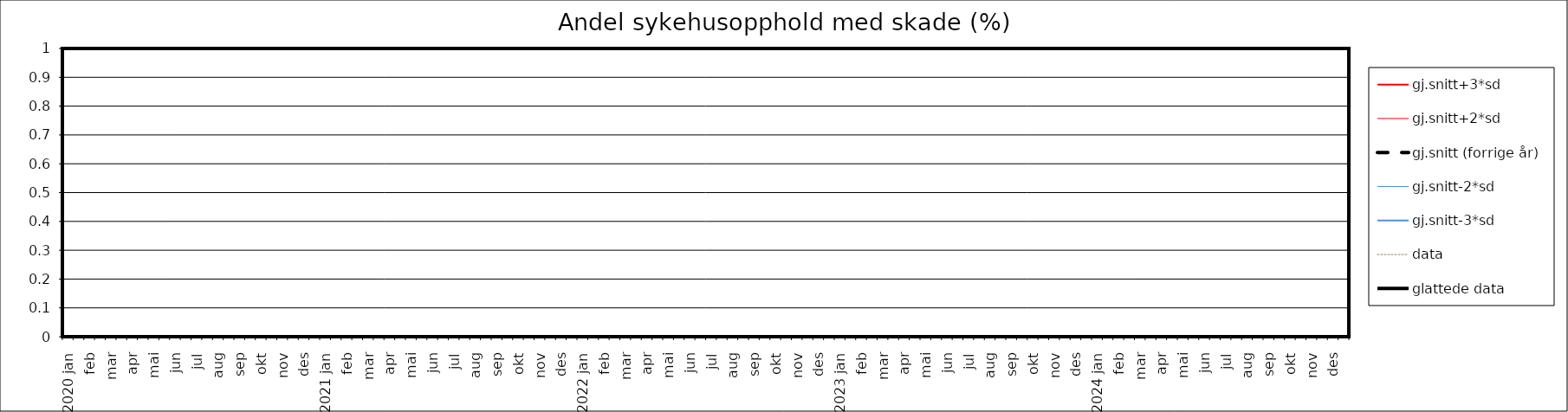
| Category | gj.snitt+3*sd | gj.snitt+2*sd | gj.snitt (forrige år) | gj.snitt-2*sd | gj.snitt-3*sd | data | glattede data |
|---|---|---|---|---|---|---|---|
| 2020 jan | 0 | 0 | 0 | 0 | 0 | 0 | 0 |
|  | 0 | 0 | 0 | 0 | 0 | 0 | 0 |
| feb | 0 | 0 | 0 | 0 | 0 | 0 | 0 |
|  | 0 | 0 | 0 | 0 | 0 | 0 | 0 |
| mar | 0 | 0 | 0 | 0 | 0 | 0 | 0 |
|  | 0 | 0 | 0 | 0 | 0 | 0 | 0 |
| apr | 0 | 0 | 0 | 0 | 0 | 0 | 0 |
|  | 0 | 0 | 0 | 0 | 0 | 0 | 0 |
| mai | 0 | 0 | 0 | 0 | 0 | 0 | 0 |
|  | 0 | 0 | 0 | 0 | 0 | 0 | 0 |
| jun | 0 | 0 | 0 | 0 | 0 | 0 | 0 |
|  | 0 | 0 | 0 | 0 | 0 | 0 | 0 |
| jul | 0 | 0 | 0 | 0 | 0 | 0 | 0 |
|  | 0 | 0 | 0 | 0 | 0 | 0 | 0 |
| aug | 0 | 0 | 0 | 0 | 0 | 0 | 0 |
|  | 0 | 0 | 0 | 0 | 0 | 0 | 0 |
| sep | 0 | 0 | 0 | 0 | 0 | 0 | 0 |
|  | 0 | 0 | 0 | 0 | 0 | 0 | 0 |
| okt | 0 | 0 | 0 | 0 | 0 | 0 | 0 |
|  | 0 | 0 | 0 | 0 | 0 | 0 | 0 |
| nov | 0 | 0 | 0 | 0 | 0 | 0 | 0 |
|  | 0 | 0 | 0 | 0 | 0 | 0 | 0 |
| des | 0 | 0 | 0 | 0 | 0 | 0 | 0 |
|  | 0 | 0 | 0 | 0 | 0 | 0 | 0 |
| 2021 jan | 0 | 0 | 0 | 0 | 0 | 0 | 0 |
|  | 0 | 0 | 0 | 0 | 0 | 0 | 0 |
| feb | 0 | 0 | 0 | 0 | 0 | 0 | 0 |
|  | 0 | 0 | 0 | 0 | 0 | 0 | 0 |
| mar | 0 | 0 | 0 | 0 | 0 | 0 | 0 |
|  | 0 | 0 | 0 | 0 | 0 | 0 | 0 |
| apr | 0 | 0 | 0 | 0 | 0 | 0 | 0 |
|  | 0 | 0 | 0 | 0 | 0 | 0 | 0 |
| mai | 0 | 0 | 0 | 0 | 0 | 0 | 0 |
|  | 0 | 0 | 0 | 0 | 0 | 0 | 0 |
| jun | 0 | 0 | 0 | 0 | 0 | 0 | 0 |
|  | 0 | 0 | 0 | 0 | 0 | 0 | 0 |
| jul | 0 | 0 | 0 | 0 | 0 | 0 | 0 |
|  | 0 | 0 | 0 | 0 | 0 | 0 | 0 |
| aug | 0 | 0 | 0 | 0 | 0 | 0 | 0 |
|  | 0 | 0 | 0 | 0 | 0 | 0 | 0 |
| sep | 0 | 0 | 0 | 0 | 0 | 0 | 0 |
|  | 0 | 0 | 0 | 0 | 0 | 0 | 0 |
| okt | 0 | 0 | 0 | 0 | 0 | 0 | 0 |
|  | 0 | 0 | 0 | 0 | 0 | 0 | 0 |
| nov | 0 | 0 | 0 | 0 | 0 | 0 | 0 |
|  | 0 | 0 | 0 | 0 | 0 | 0 | 0 |
| des | 0 | 0 | 0 | 0 | 0 | 0 | 0 |
|  | 0 | 0 | 0 | 0 | 0 | 0 | 0 |
| 2022 jan | 0 | 0 | 0 | 0 | 0 | 0 | 0 |
|  | 0 | 0 | 0 | 0 | 0 | 0 | 0 |
| feb | 0 | 0 | 0 | 0 | 0 | 0 | 0 |
|  | 0 | 0 | 0 | 0 | 0 | 0 | 0 |
| mar | 0 | 0 | 0 | 0 | 0 | 0 | 0 |
|  | 0 | 0 | 0 | 0 | 0 | 0 | 0 |
| apr | 0 | 0 | 0 | 0 | 0 | 0 | 0 |
|  | 0 | 0 | 0 | 0 | 0 | 0 | 0 |
| mai | 0 | 0 | 0 | 0 | 0 | 0 | 0 |
|  | 0 | 0 | 0 | 0 | 0 | 0 | 0 |
| jun | 0 | 0 | 0 | 0 | 0 | 0 | 0 |
|  | 0 | 0 | 0 | 0 | 0 | 0 | 0 |
| jul | 0 | 0 | 0 | 0 | 0 | 0 | 0 |
|  | 0 | 0 | 0 | 0 | 0 | 0 | 0 |
| aug | 0 | 0 | 0 | 0 | 0 | 0 | 0 |
|  | 0 | 0 | 0 | 0 | 0 | 0 | 0 |
| sep | 0 | 0 | 0 | 0 | 0 | 0 | 0 |
|  | 0 | 0 | 0 | 0 | 0 | 0 | 0 |
| okt | 0 | 0 | 0 | 0 | 0 | 0 | 0 |
|  | 0 | 0 | 0 | 0 | 0 | 0 | 0 |
| nov | 0 | 0 | 0 | 0 | 0 | 0 | 0 |
|  | 0 | 0 | 0 | 0 | 0 | 0 | 0 |
| des | 0 | 0 | 0 | 0 | 0 | 0 | 0 |
|  | 0 | 0 | 0 | 0 | 0 | 0 | 0 |
| 2023 jan | 0 | 0 | 0 | 0 | 0 | 0 | 0 |
|  | 0 | 0 | 0 | 0 | 0 | 0 | 0 |
| feb | 0 | 0 | 0 | 0 | 0 | 0 | 0 |
|  | 0 | 0 | 0 | 0 | 0 | 0 | 0 |
| mar | 0 | 0 | 0 | 0 | 0 | 0 | 0 |
|  | 0 | 0 | 0 | 0 | 0 | 0 | 0 |
| apr | 0 | 0 | 0 | 0 | 0 | 0 | 0 |
|  | 0 | 0 | 0 | 0 | 0 | 0 | 0 |
| mai | 0 | 0 | 0 | 0 | 0 | 0 | 0 |
|  | 0 | 0 | 0 | 0 | 0 | 0 | 0 |
| jun | 0 | 0 | 0 | 0 | 0 | 0 | 0 |
|  | 0 | 0 | 0 | 0 | 0 | 0 | 0 |
| jul | 0 | 0 | 0 | 0 | 0 | 0 | 0 |
|  | 0 | 0 | 0 | 0 | 0 | 0 | 0 |
| aug | 0 | 0 | 0 | 0 | 0 | 0 | 0 |
|  | 0 | 0 | 0 | 0 | 0 | 0 | 0 |
| sep | 0 | 0 | 0 | 0 | 0 | 0 | 0 |
|  | 0 | 0 | 0 | 0 | 0 | 0 | 0 |
| okt | 0 | 0 | 0 | 0 | 0 | 0 | 0 |
|  | 0 | 0 | 0 | 0 | 0 | 0 | 0 |
| nov | 0 | 0 | 0 | 0 | 0 | 0 | 0 |
|  | 0 | 0 | 0 | 0 | 0 | 0 | 0 |
| des | 0 | 0 | 0 | 0 | 0 | 0 | 0 |
|  | 0 | 0 | 0 | 0 | 0 | 0 | 0 |
| 2024 jan | 0 | 0 | 0 | 0 | 0 | 0 | 0 |
|  | 0 | 0 | 0 | 0 | 0 | 0 | 0 |
| feb | 0 | 0 | 0 | 0 | 0 | 0 | 0 |
|  | 0 | 0 | 0 | 0 | 0 | 0 | 0 |
| mar | 0 | 0 | 0 | 0 | 0 | 0 | 0 |
|  | 0 | 0 | 0 | 0 | 0 | 0 | 0 |
| apr | 0 | 0 | 0 | 0 | 0 | 0 | 0 |
|  | 0 | 0 | 0 | 0 | 0 | 0 | 0 |
| mai | 0 | 0 | 0 | 0 | 0 | 0 | 0 |
|  | 0 | 0 | 0 | 0 | 0 | 0 | 0 |
| jun | 0 | 0 | 0 | 0 | 0 | 0 | 0 |
|  | 0 | 0 | 0 | 0 | 0 | 0 | 0 |
| jul | 0 | 0 | 0 | 0 | 0 | 0 | 0 |
|  | 0 | 0 | 0 | 0 | 0 | 0 | 0 |
| aug | 0 | 0 | 0 | 0 | 0 | 0 | 0 |
|  | 0 | 0 | 0 | 0 | 0 | 0 | 0 |
| sep | 0 | 0 | 0 | 0 | 0 | 0 | 0 |
|  | 0 | 0 | 0 | 0 | 0 | 0 | 0 |
| okt | 0 | 0 | 0 | 0 | 0 | 0 | 0 |
|  | 0 | 0 | 0 | 0 | 0 | 0 | 0 |
| nov | 0 | 0 | 0 | 0 | 0 | 0 | 0 |
|  | 0 | 0 | 0 | 0 | 0 | 0 | 0 |
| des | 0 | 0 | 0 | 0 | 0 | 0 | 0 |